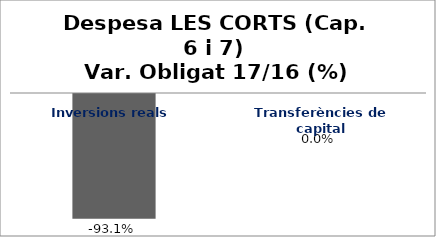
| Category | Series 0 |
|---|---|
| Inversions reals | -0.931 |
| Transferències de capital | 0 |